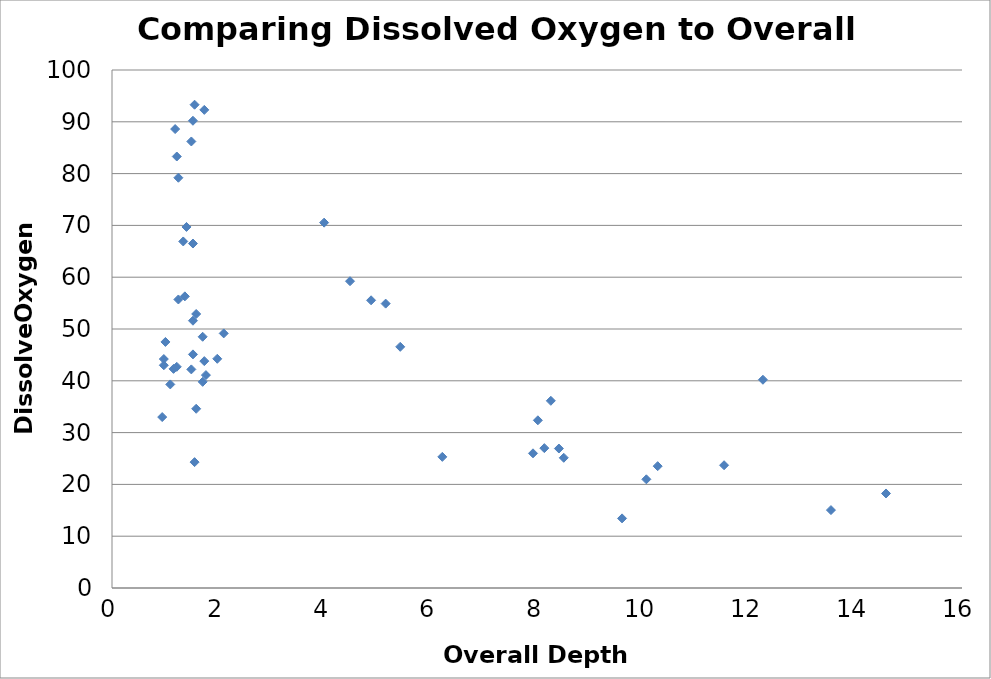
| Category | Dissolved Oxygen % |
|---|---|
| 1.5849600000000001 | 52.9 |
| 1.524 | 51.6 |
| 1.24968 | 55.7 |
| 1.3716000000000002 | 56.3 |
| 1.00584 | 47.5 |
| 4.8768 | 55.54 |
| 8.26008 | 36.138 |
| 4.48056 | 59.225 |
| 8.50392 | 25.138 |
| 9.6012 | 13.44 |
| 1.70688 | 39.8 |
| 2.10312 | 49.15 |
| 1.70688 | 48.5 |
| 1.15824 | 42.3 |
| 5.425440000000001 | 46.56 |
| 8.138160000000001 | 27 |
| 11.52144 | 23.7 |
| 6.2179199999999994 | 25.317 |
| 8.01624 | 32.375 |
| 10.271760000000002 | 23.52 |
| 1.4935200000000002 | 42.2 |
| 0.9753600000000001 | 44.2 |
| 1.09728 | 39.3 |
| 1.9812 | 44.25 |
| 1.7373600000000002 | 43.8 |
| 10.0584 | 20.98 |
| 1.524 | 66.5 |
| 1.40208 | 69.7 |
| 5.15112 | 54.9 |
| 1.34112 | 66.9 |
| 1.5544799999999999 | 93.3 |
| 1.18872 | 88.6 |
| 3.99288 | 70.533 |
| 1.2192 | 83.3 |
| 1.24968 | 79.2 |
| 1.4935200000000002 | 86.2 |
| 1.7373600000000002 | 92.3 |
| 1.524 | 90.2 |
| 8.41248 | 26.925 |
| 13.53312 | 15.042 |
| 12.252960000000002 | 40.2 |
| 14.56944 | 18.247 |
| 1.76784 | 41.1 |
| 7.9248 | 26 |
| 1.524 | 45.1 |
| 0.94488 | 33 |
| 1.5544799999999999 | 24.3 |
| 1.5849600000000001 | 34.6 |
| 1.2192 | 42.7 |
| 0.9753600000000001 | 43 |